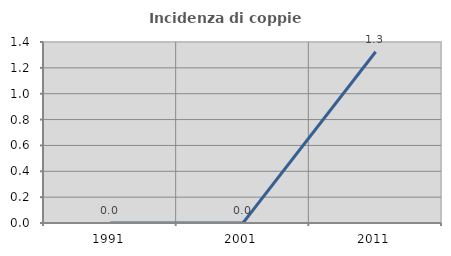
| Category | Incidenza di coppie miste |
|---|---|
| 1991.0 | 0 |
| 2001.0 | 0 |
| 2011.0 | 1.325 |